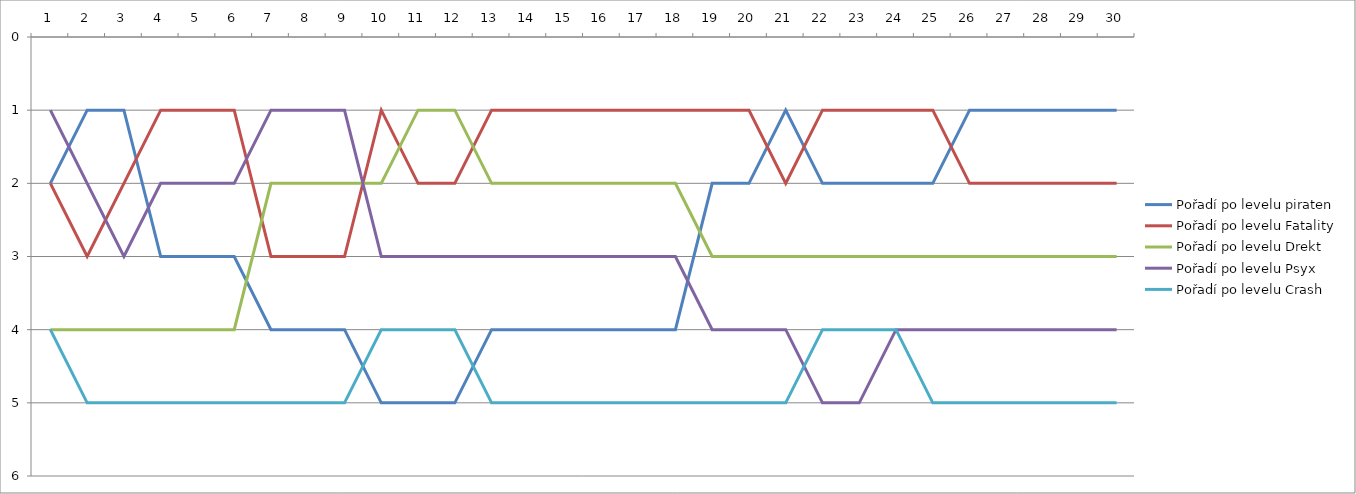
| Category | Pořadí po levelu piraten | Pořadí po levelu Fatality | Pořadí po levelu Drekt | Pořadí po levelu Psyx | Pořadí po levelu Crash |
|---|---|---|---|---|---|
| 0 | 2 | 2 | 4 | 1 | 4 |
| 1 | 1 | 3 | 4 | 2 | 5 |
| 2 | 1 | 2 | 4 | 3 | 5 |
| 3 | 3 | 1 | 4 | 2 | 5 |
| 4 | 3 | 1 | 4 | 2 | 5 |
| 5 | 3 | 1 | 4 | 2 | 5 |
| 6 | 4 | 3 | 2 | 1 | 5 |
| 7 | 4 | 3 | 2 | 1 | 5 |
| 8 | 4 | 3 | 2 | 1 | 5 |
| 9 | 5 | 1 | 2 | 3 | 4 |
| 10 | 5 | 2 | 1 | 3 | 4 |
| 11 | 5 | 2 | 1 | 3 | 4 |
| 12 | 4 | 1 | 2 | 3 | 5 |
| 13 | 4 | 1 | 2 | 3 | 5 |
| 14 | 4 | 1 | 2 | 3 | 5 |
| 15 | 4 | 1 | 2 | 3 | 5 |
| 16 | 4 | 1 | 2 | 3 | 5 |
| 17 | 4 | 1 | 2 | 3 | 5 |
| 18 | 2 | 1 | 3 | 4 | 5 |
| 19 | 2 | 1 | 3 | 4 | 5 |
| 20 | 1 | 2 | 3 | 4 | 5 |
| 21 | 2 | 1 | 3 | 5 | 4 |
| 22 | 2 | 1 | 3 | 5 | 4 |
| 23 | 2 | 1 | 3 | 4 | 4 |
| 24 | 2 | 1 | 3 | 4 | 5 |
| 25 | 1 | 2 | 3 | 4 | 5 |
| 26 | 1 | 2 | 3 | 4 | 5 |
| 27 | 1 | 2 | 3 | 4 | 5 |
| 28 | 1 | 2 | 3 | 4 | 5 |
| 29 | 1 | 2 | 3 | 4 | 5 |